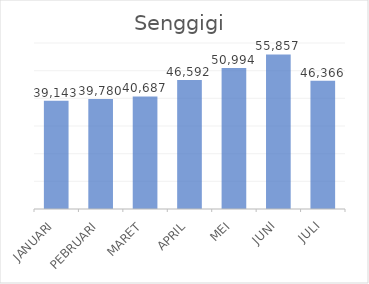
| Category |  39,143  |
|---|---|
| JANUARI | 39143 |
| PEBRUARI | 39780 |
| MARET | 40687 |
| APRIL | 46592 |
| MEI | 50994 |
| JUNI | 55857 |
| JULI | 46366 |